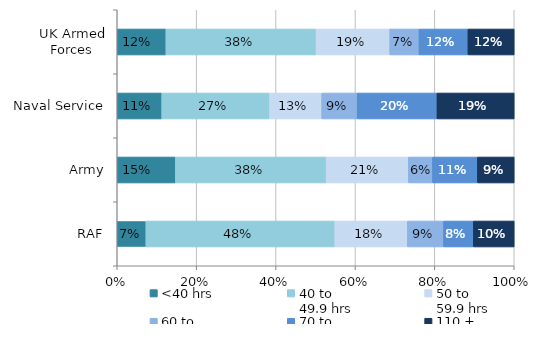
| Category | <40 hrs | 40 to 
49.9 hrs | 50 to 
59.9 hrs | 60 to 
69.9 hrs | 70 to 
109.9 hrs | 110 + 
hrs |
|---|---|---|---|---|---|---|
| UK Armed Forces | 0.123 | 0.378 | 0.186 | 0.074 | 0.123 | 0.117 |
| Naval Service | 0.112 | 0.272 | 0.131 | 0.089 | 0.201 | 0.195 |
| Army | 0.147 | 0.38 | 0.207 | 0.061 | 0.113 | 0.093 |
| RAF | 0.073 | 0.476 | 0.183 | 0.091 | 0.075 | 0.103 |